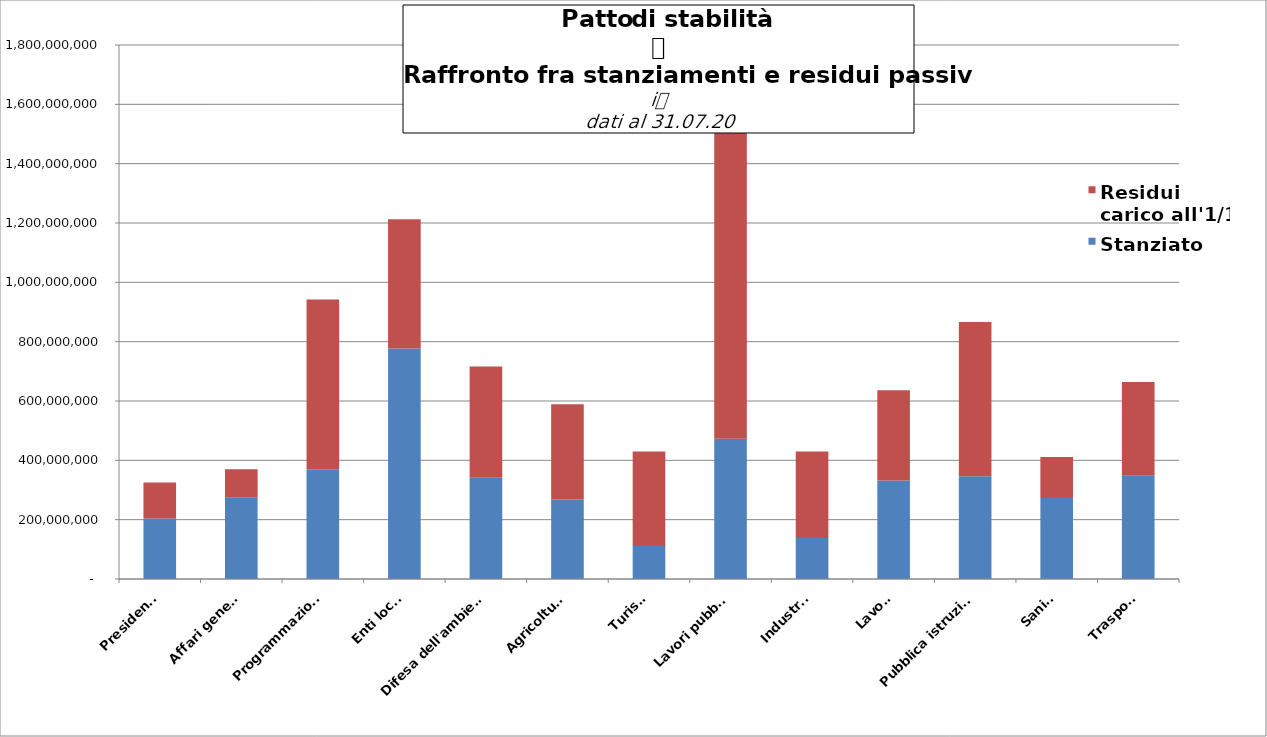
| Category | Stanziato | Residui
carico all'1/1 |
|---|---|---|
| Presidenza | 204083416.23 | 121046092.843 |
| Affari generali | 273980156.708 | 96001265.738 |
| Programmazione | 370348944.9 | 572170607.979 |
| Enti locali | 777210960.38 | 435223180.795 |
| Difesa dell'ambiente | 341253502.896 | 375068156.407 |
| Agricoltura | 268275869.163 | 321052880.095 |
| Turismo | 111067395.86 | 319127042.232 |
| Lavori pubblici | 473047650.642 | 1078124679.395 |
| Industria | 138068039.92 | 291453980.645 |
| Lavoro | 332359032.3 | 304218956.289 |
| Pubblica istruzione | 346137370.56 | 520193678.579 |
| Sanità | 272983665.17 | 138132253.715 |
| Trasporti | 348020659.12 | 316427183.52 |